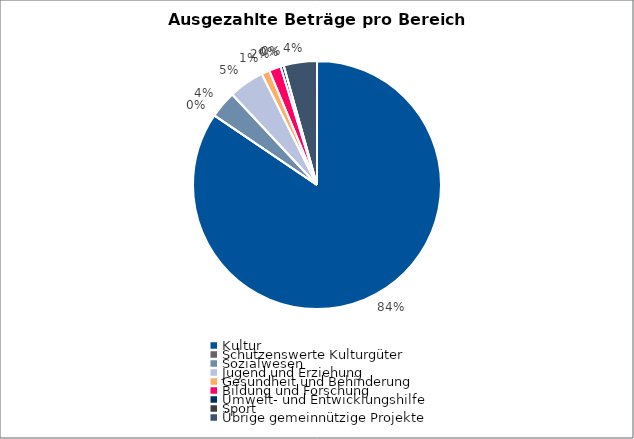
| Category | Series 0 |
|---|---|
| Kultur | 7530755 |
| Schützenswerte Kulturgüter | 0 |
| Sozialwesen | 315612 |
| Jugend und Erziehung | 413247 |
| Gesundheit und Behinderung | 93900 |
| Bildung und Forschung | 137460 |
| Umwelt- und Entwicklungshilfe | 37300 |
| Sport | 0 |
| Übrige gemeinnützige Projekte | 386527 |